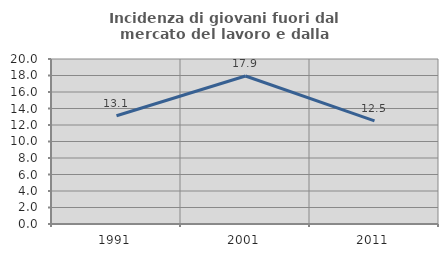
| Category | Incidenza di giovani fuori dal mercato del lavoro e dalla formazione  |
|---|---|
| 1991.0 | 13.117 |
| 2001.0 | 17.943 |
| 2011.0 | 12.508 |